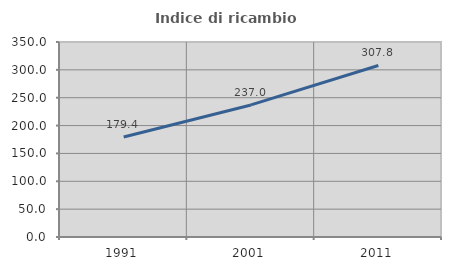
| Category | Indice di ricambio occupazionale  |
|---|---|
| 1991.0 | 179.365 |
| 2001.0 | 237.037 |
| 2011.0 | 307.843 |